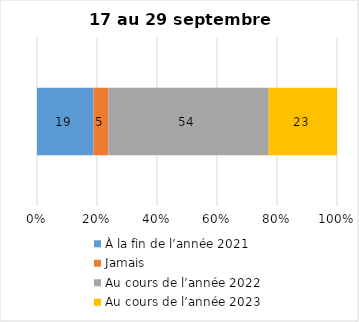
| Category | À la fin de l’année 2021 | Jamais | Au cours de l’année 2022 | Au cours de l’année 2023 |
|---|---|---|---|---|
| 0 | 19 | 5 | 54 | 23 |